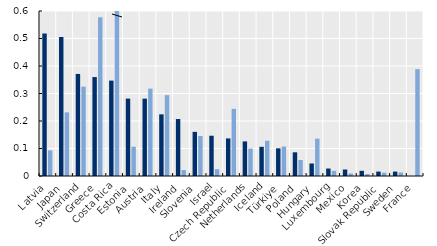
| Category | 2019 | 2010 |
|---|---|---|
| Latvia | 0.518 | 0.093 |
| Japan | 0.505 | 0.231 |
| Switzerland | 0.371 | 0.325 |
| Greece | 0.36 | 0.577 |
| Costa Rica | 0.347 | 1.213 |
| Estonia | 0.281 | 0.106 |
| Austria | 0.281 | 0.318 |
| Italy | 0.224 | 0.294 |
| Ireland | 0.207 | 0.022 |
| Slovenia | 0.16 | 0.146 |
| Israel | 0.146 | 0.025 |
| Czech Republic | 0.137 | 0.244 |
| Netherlands | 0.126 | 0.1 |
| Iceland | 0.106 | 0.128 |
| Türkiye | 0.101 | 0.107 |
| Poland | 0.086 | 0.058 |
| Hungary | 0.046 | 0.136 |
| Luxembourg | 0.027 | 0.019 |
| Mexico | 0.024 | 0.009 |
| Korea | 0.019 | 0.007 |
| Slovak Republic | 0.016 | 0.012 |
| Sweden | 0.016 | 0.013 |
| France | 0 | 0.389 |